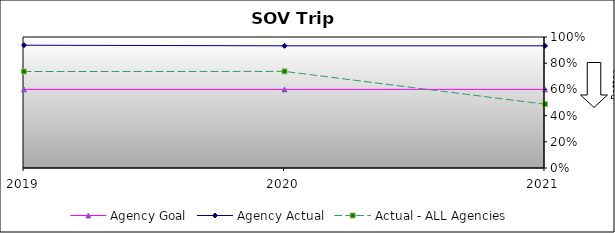
| Category | Agency Goal | Agency Actual | Actual - ALL Agencies |
|---|---|---|---|
| 2019.0 | 0.6 | 0.937 | 0.736 |
| 2020.0 | 0.6 | 0.933 | 0.737 |
| 2021.0 | 0.6 | 0.933 | 0.487 |